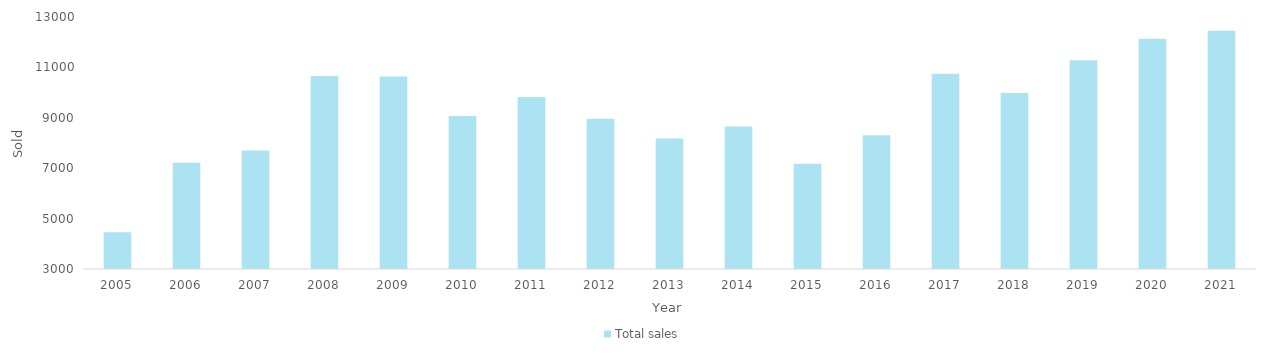
| Category | Total sales |
|---|---|
| 2005.0 | 4457 |
| 2006.0 | 7220 |
| 2007.0 | 7704 |
| 2008.0 | 10662 |
| 2009.0 | 10639 |
| 2010.0 | 9072 |
| 2011.0 | 9821 |
| 2012.0 | 8967 |
| 2013.0 | 8180 |
| 2014.0 | 8659 |
| 2015.0 | 7177 |
| 2016.0 | 8310 |
| 2017.0 | 10751 |
| 2018.0 | 9983 |
| 2019.0 | 11285 |
| 2020.0 | 12137 |
| 2021.0 | 12450 |